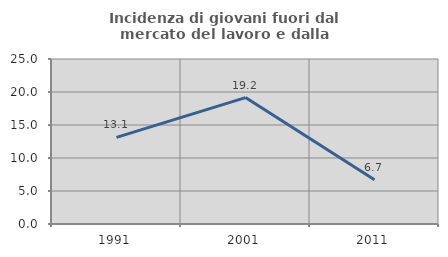
| Category | Incidenza di giovani fuori dal mercato del lavoro e dalla formazione  |
|---|---|
| 1991.0 | 13.125 |
| 2001.0 | 19.154 |
| 2011.0 | 6.7 |